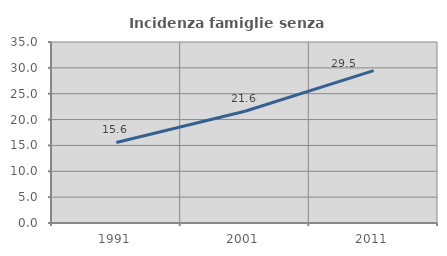
| Category | Incidenza famiglie senza nuclei |
|---|---|
| 1991.0 | 15.571 |
| 2001.0 | 21.602 |
| 2011.0 | 29.459 |